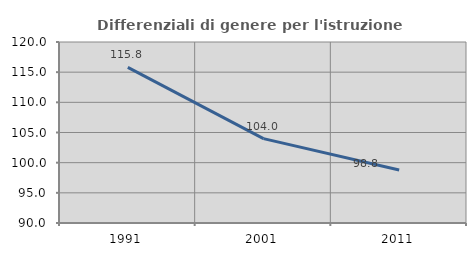
| Category | Differenziali di genere per l'istruzione superiore |
|---|---|
| 1991.0 | 115.787 |
| 2001.0 | 103.983 |
| 2011.0 | 98.777 |